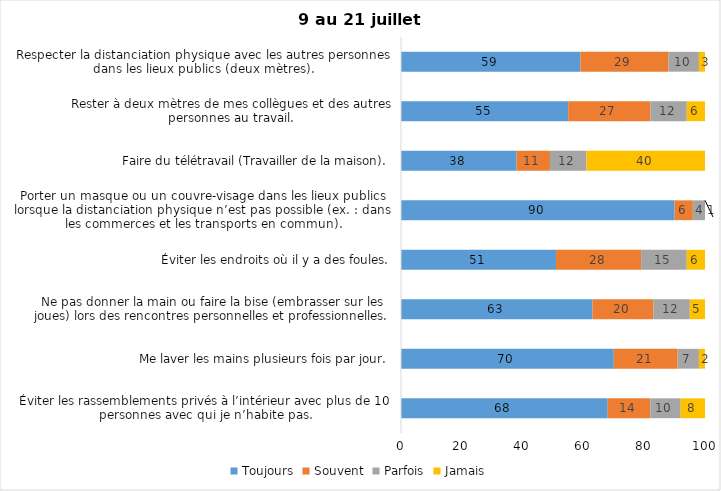
| Category | Toujours | Souvent | Parfois | Jamais |
|---|---|---|---|---|
| Éviter les rassemblements privés à l’intérieur avec plus de 10 personnes avec qui je n’habite pas. | 68 | 14 | 10 | 8 |
| Me laver les mains plusieurs fois par jour. | 70 | 21 | 7 | 2 |
| Ne pas donner la main ou faire la bise (embrasser sur les joues) lors des rencontres personnelles et professionnelles. | 63 | 20 | 12 | 5 |
| Éviter les endroits où il y a des foules. | 51 | 28 | 15 | 6 |
| Porter un masque ou un couvre-visage dans les lieux publics lorsque la distanciation physique n’est pas possible (ex. : dans les commerces et les transports en commun). | 90 | 6 | 4 | 1 |
| Faire du télétravail (Travailler de la maison). | 38 | 11 | 12 | 40 |
| Rester à deux mètres de mes collègues et des autres personnes au travail. | 55 | 27 | 12 | 6 |
| Respecter la distanciation physique avec les autres personnes dans les lieux publics (deux mètres). | 59 | 29 | 10 | 3 |